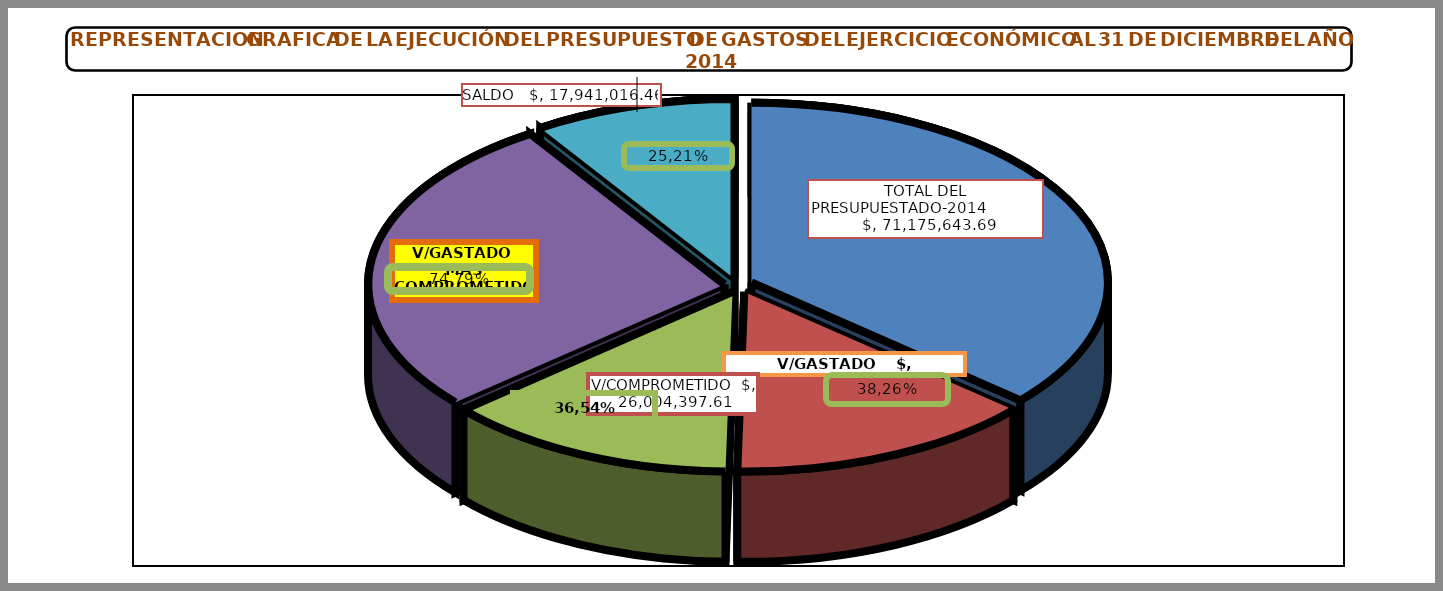
| Category | TOTALES DE PRESUPUESTO DEL AÑO 2014 |
|---|---|
| TOTAL DEL PRESUPUESTADO-2014     $ | 71175643.69 |
| V/GASTADO    $ | 27230229.62 |
| V/COMPROMETIDO  $ | 26004397.61 |
| V/GASTADO  MAS COMPROMETIDO  $  | 53234627.23 |
| SALDO   $ | 17941016.46 |